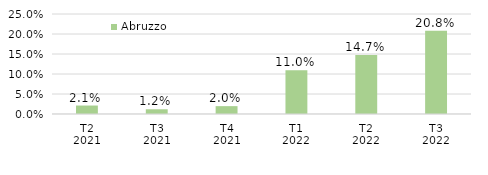
| Category | Abruzzo |
|---|---|
| T2
2021 | 0.021 |
| T3
2021 | 0.012 |
| T4
2021 | 0.02 |
| T1
2022 | 0.11 |
| T2
2022 | 0.147 |
| T3
2022 | 0.208 |